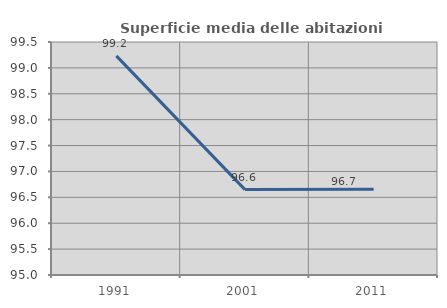
| Category | Superficie media delle abitazioni occupate |
|---|---|
| 1991.0 | 99.231 |
| 2001.0 | 96.649 |
| 2011.0 | 96.658 |